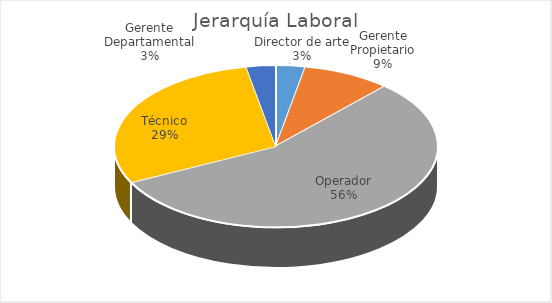
| Category | Total |
|---|---|
| Director de arte | 1 |
| Gerente Propietario | 3 |
| Operador | 19 |
| Técnico | 10 |
| Gerente Departamental | 1 |